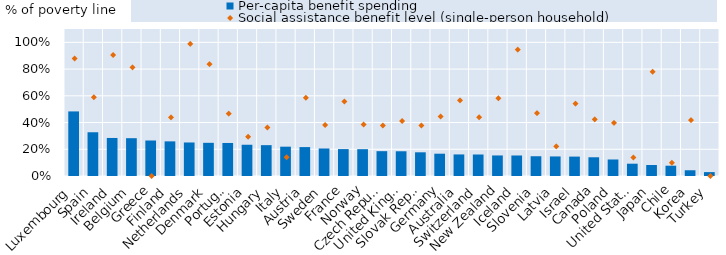
| Category | Per-capita benefit spending |
|---|---|
| Luxembourg | 0.483 |
| Spain | 0.327 |
| Ireland | 0.285 |
| Belgium | 0.283 |
| Greece | 0.266 |
| Finland | 0.259 |
| Netherlands | 0.251 |
| Denmark | 0.248 |
| Portugal | 0.247 |
| Estonia | 0.234 |
| Hungary | 0.231 |
| Italy | 0.219 |
| Austria | 0.216 |
| Sweden | 0.206 |
| France | 0.201 |
| Norway | 0.201 |
| Czech Republic | 0.186 |
| United Kingdom | 0.185 |
| Slovak Republic | 0.177 |
| Germany | 0.167 |
| Australia | 0.161 |
| Switzerland | 0.161 |
| New Zealand | 0.154 |
| Iceland | 0.154 |
| Slovenia | 0.148 |
| Latvia | 0.146 |
| Israel | 0.145 |
| Canada | 0.14 |
| Poland | 0.124 |
| United States | 0.092 |
| Japan | 0.082 |
| Chile | 0.077 |
| Korea | 0.043 |
| Turkey | 0.029 |